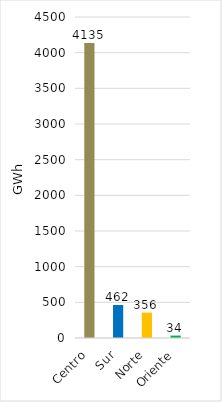
| Category | Series 0 |
|---|---|
| Centro | 4135.492 |
| Sur | 462.152 |
| Norte | 356.468 |
| Oriente | 33.83 |